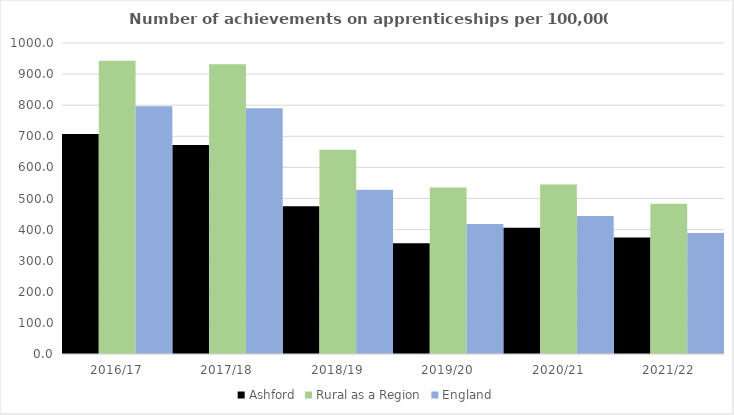
| Category | Ashford | Rural as a Region | England |
|---|---|---|---|
| 2016/17 | 707 | 942.594 | 797 |
| 2017/18 | 672 | 931.709 | 790 |
| 2018/19 | 475 | 656.44 | 528 |
| 2019/20 | 356 | 535.552 | 418 |
| 2020/21 | 406 | 545.333 | 444 |
| 2021/22 | 375 | 482.936 | 389 |